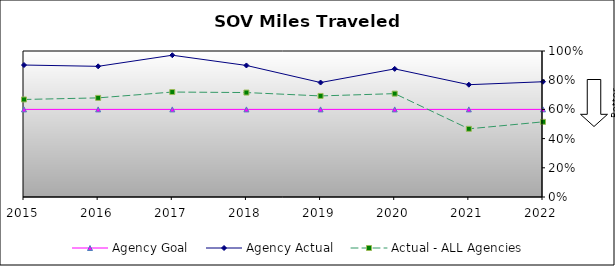
| Category | Agency Goal | Agency Actual | Actual - ALL Agencies |
|---|---|---|---|
| 2015.0 | 0.6 | 0.904 | 0.668 |
| 2016.0 | 0.6 | 0.895 | 0.679 |
| 2017.0 | 0.6 | 0.971 | 0.719 |
| 2018.0 | 0.6 | 0.901 | 0.715 |
| 2019.0 | 0.6 | 0.784 | 0.692 |
| 2020.0 | 0.6 | 0.878 | 0.708 |
| 2021.0 | 0.6 | 0.769 | 0.467 |
| 2022.0 | 0.6 | 0.789 | 0.515 |